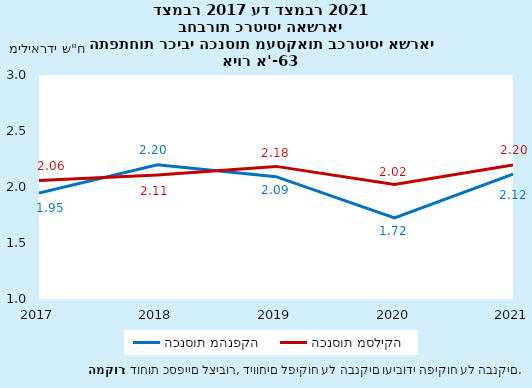
| Category | הכנסות מהנפקה | הכנסות מסליקה |
|---|---|---|
| 2017-12-31 | 1.945 | 2.058 |
| 2018-12-31 | 2.199 | 2.108 |
| 2019-12-31 | 2.092 | 2.184 |
| 2020-12-31 | 1.723 | 2.022 |
| 2021-12-31 | 2.115 | 2.196 |